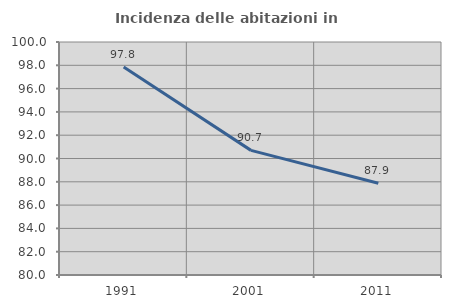
| Category | Incidenza delle abitazioni in proprietà  |
|---|---|
| 1991.0 | 97.849 |
| 2001.0 | 90.698 |
| 2011.0 | 87.879 |